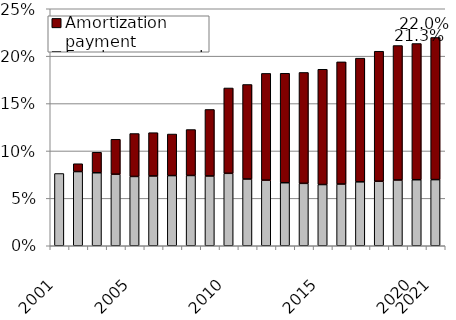
| Category | Employer normal cost | Amortization payment |
|---|---|---|
| 2001.0 | 0.076 | 0 |
| nan | 0.078 | 0.008 |
| nan | 0.077 | 0.022 |
| nan | 0.075 | 0.037 |
| 2005.0 | 0.073 | 0.045 |
| nan | 0.074 | 0.046 |
| nan | 0.074 | 0.044 |
| nan | 0.074 | 0.048 |
| nan | 0.074 | 0.07 |
| 2010.0 | 0.076 | 0.09 |
| nan | 0.07 | 0.1 |
| nan | 0.069 | 0.113 |
| nan | 0.066 | 0.115 |
| nan | 0.066 | 0.117 |
| 2015.0 | 0.065 | 0.122 |
| nan | 0.065 | 0.129 |
| nan | 0.067 | 0.13 |
| nan | 0.068 | 0.137 |
| nan | 0.069 | 0.142 |
| 2020.0 | 0.07 | 0.144 |
| 2021.0 | 0.07 | 0.15 |